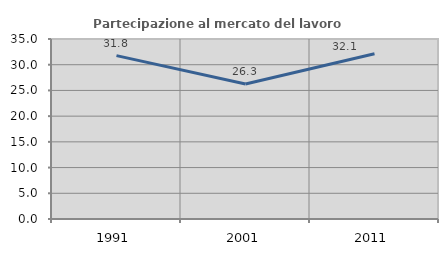
| Category | Partecipazione al mercato del lavoro  femminile |
|---|---|
| 1991.0 | 31.77 |
| 2001.0 | 26.26 |
| 2011.0 | 32.143 |